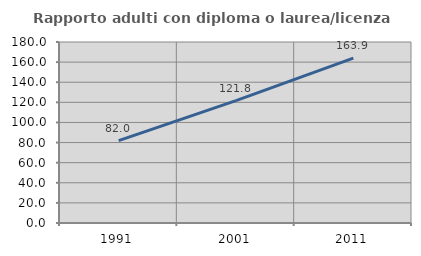
| Category | Rapporto adulti con diploma o laurea/licenza media  |
|---|---|
| 1991.0 | 81.956 |
| 2001.0 | 121.772 |
| 2011.0 | 163.894 |